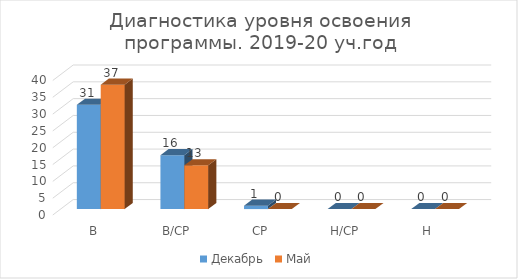
| Category | Декабрь | Май |
|---|---|---|
| В | 31 | 37 |
| В/СР | 16 | 13 |
| СР | 1 | 0 |
| Н/СР | 0 | 0 |
| Н | 0 | 0 |